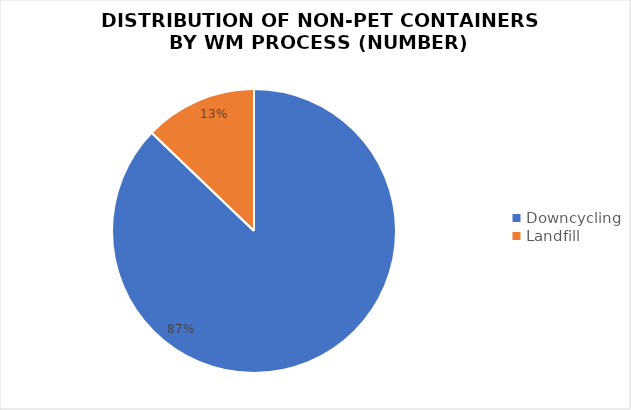
| Category | Series 0 |
|---|---|
| Downcycling | 958 |
| Landfill | 141 |